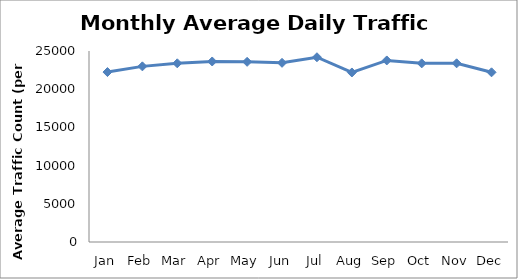
| Category | Series 0 |
|---|---|
| Jan | 22243.75 |
| Feb | 22987.75 |
| Mar | 23390 |
| Apr | 23627.75 |
| May | 23582 |
| Jun | 23452.25 |
| Jul | 24182.75 |
| Aug | 22188 |
| Sep | 23763.75 |
| Oct | 23381 |
| Nov | 23387.75 |
| Dec | 22211.25 |